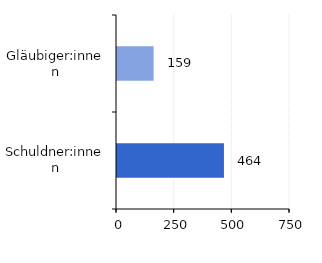
| Category | Series 0 |
|---|---|
| Gläubiger:innen | 158.711 |
| Schuldner:innen | 463.692 |